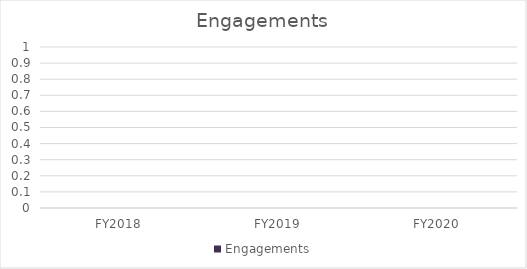
| Category | Engagements |
|---|---|
| FY2018 | 0 |
| FY2019 | 0 |
| FY2020 | 0 |